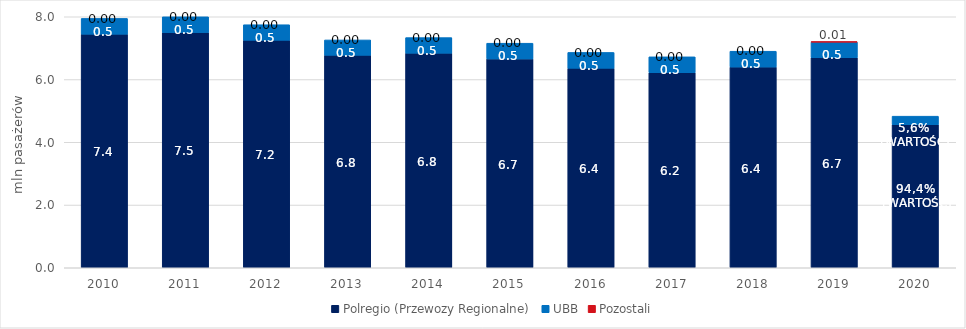
| Category | Polregio (Przewozy Regionalne) | UBB | Pozostali |
|---|---|---|---|
| 2010 | 7.445 | 0.503 | 0 |
| 2011 | 7.497 | 0.501 | 0 |
| 2012 | 7.25 | 0.497 | 0 |
| 2013 | 6.771 | 0.49 | 0 |
| 2014 | 6.84 | 0.496 | 0 |
| 2015 | 6.656 | 0.501 | 0 |
| 2016 | 6.359 | 0.505 | 0 |
| 2017 | 6.215 | 0.508 | 0 |
| 2018 | 6.397 | 0.505 | 0 |
| 2019 | 6.695 | 0.5 | 0.01 |
| 2020 | 4.561 | 0.271 | 0 |